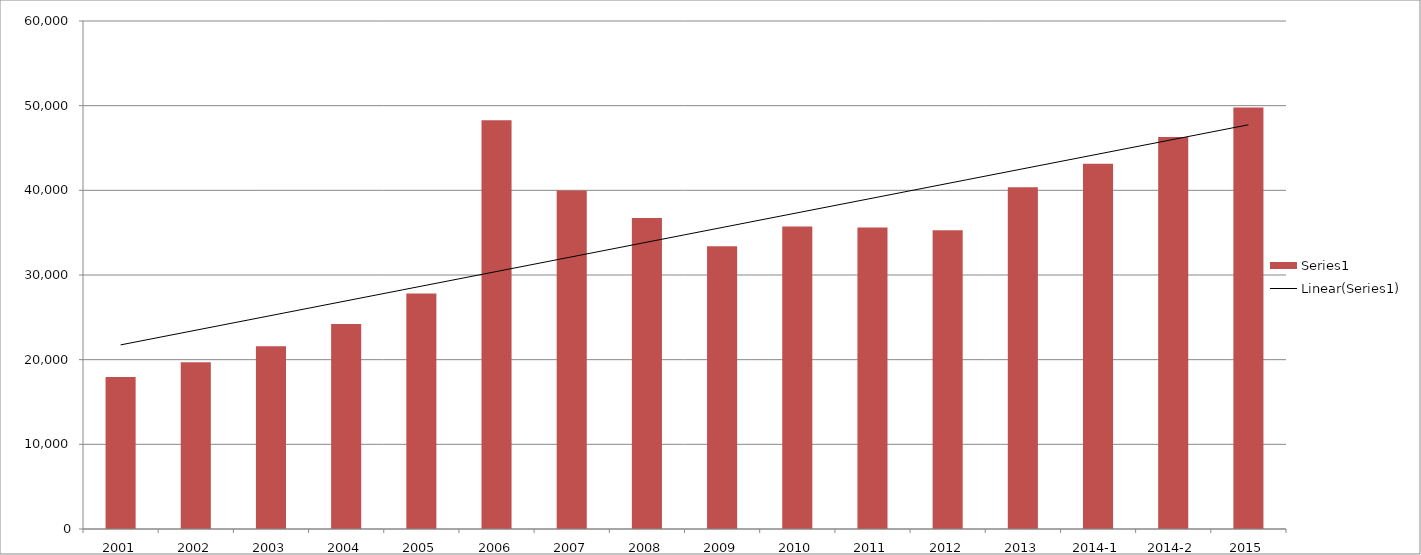
| Category | Series 1 |
|---|---|
| 2001 | 17952.333 |
| 2002 | 19701.444 |
| 2003 | 21578.889 |
| 2004 | 24203 |
| 2005 | 27816 |
| 2006 | 48283.333 |
| 2007 | 39984.625 |
| 2008 | 36745.778 |
| 2009 | 33407.4 |
| 2010 | 35733.444 |
| 2011 | 35614.889 |
| 2012 | 35274.4 |
| 2013 | 40364.938 |
| 2014-1 | 43129.833 |
| 2014-2 | 46299 |
| 2015 | 49785.217 |